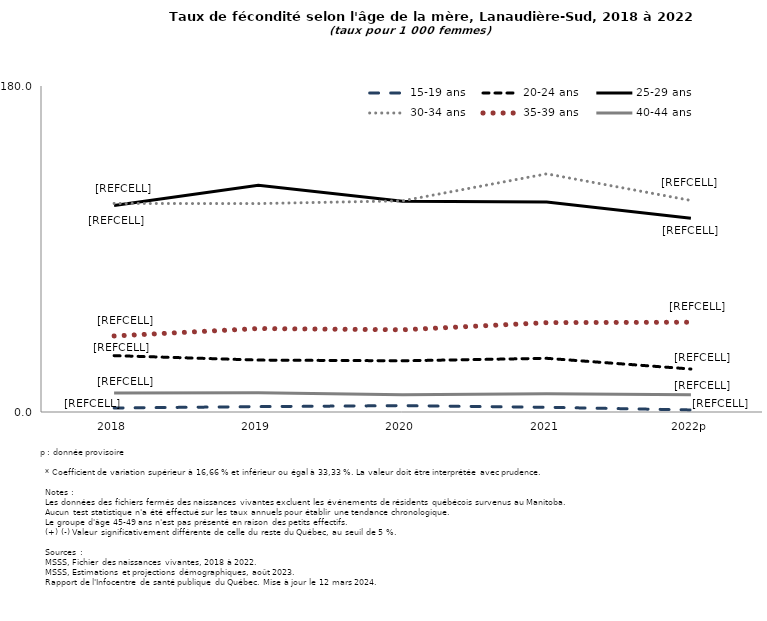
| Category | 15-19 ans | 20-24 ans | 25-29 ans | 30-34 ans | 35-39 ans | 40-44 ans |
|---|---|---|---|---|---|---|
| 2018 | 2.212 | 31.126 | 113.973 | 115.145 | 41.972 | 10.484 |
| 2019 | 2.977 | 28.672 | 125.258 | 115.08 | 46.087 | 10.561 |
| 2020 | 3.512 | 28.269 | 116.428 | 116.596 | 45.398 | 9.492 |
| 2021 | 2.603 | 29.643 | 115.938 | 131.502 | 49.341 | 10.145 |
| 2022p | 1.136 | 23.736 | 107.036 | 116.805 | 49.553 | 9.56 |